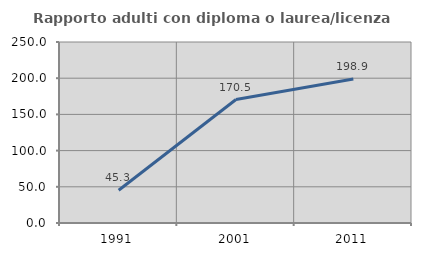
| Category | Rapporto adulti con diploma o laurea/licenza media  |
|---|---|
| 1991.0 | 45.273 |
| 2001.0 | 170.528 |
| 2011.0 | 198.938 |